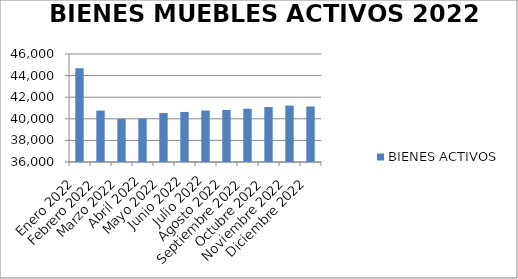
| Category | BIENES ACTIVOS |
|---|---|
| Enero 2022 | 44681 |
| Febrero 2022 | 40762 |
| Marzo 2022 | 40001 |
| Abril 2022 | 40019 |
| Mayo 2022 | 40534 |
| Junio 2022 | 40634 |
| Julio 2022 | 40766 |
| Agosto 2022 | 40814 |
| Septiembre 2022 | 40936 |
| Octubre 2022 | 41088 |
| Noviembre 2022 | 41220 |
| Diciembre 2022 | 41139 |